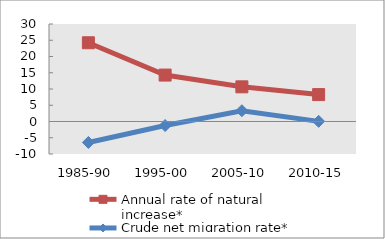
| Category | Annual rate of natural increase* | Crude net migration rate* |
|---|---|---|
| 1985-90 | 24.227 | -6.443 |
| 1995-00 | 14.286 | -1.247 |
| 2005-10 | 10.665 | 3.326 |
| 2010-15 | 8.279 | 0.044 |